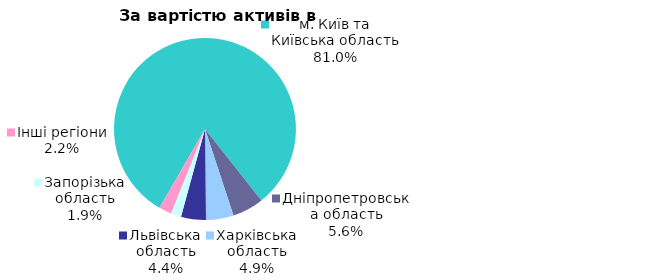
| Category | Series 0 |
|---|---|
| м. Київ та Київська область | 0.81 |
| Дніпропетровська область | 0.056 |
| Харківська область | 0.049 |
| Львівська область | 0.044 |
| Запорізька область | 0.018 |
| Інші регіони | 0.022 |